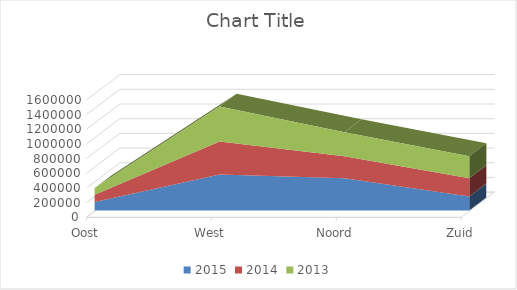
| Category | 2015 | 2014 | 2013 |
|---|---|---|---|
| Oost | 125000 | 100000 | 90000 |
| West | 500000 | 450000 | 475000 |
| Noord | 450000 | 300000 | 325751 |
| Zuid | 200000 | 250000 | 300000 |